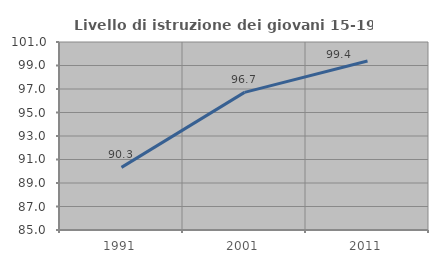
| Category | Livello di istruzione dei giovani 15-19 anni |
|---|---|
| 1991.0 | 90.33 |
| 2001.0 | 96.711 |
| 2011.0 | 99.383 |